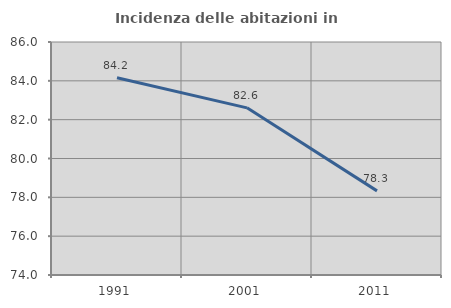
| Category | Incidenza delle abitazioni in proprietà  |
|---|---|
| 1991.0 | 84.158 |
| 2001.0 | 82.609 |
| 2011.0 | 78.333 |